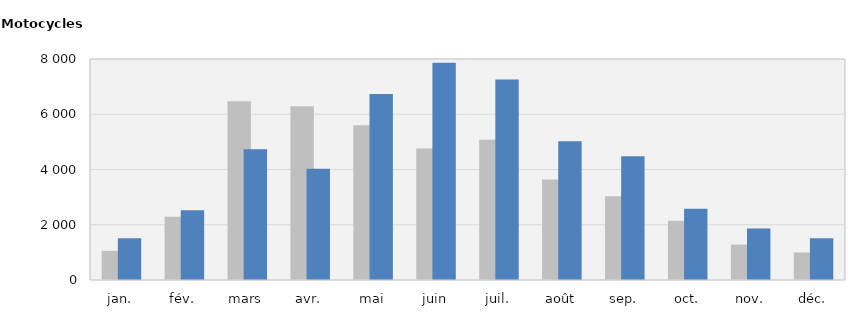
| Category | 2019 | 2020 |
|---|---|---|
| jan. | 1056 | 1512 |
| fév. | 2291 | 2527 |
| mars | 6473 | 4731 |
| avr. | 6294 | 4029 |
| mai | 5602 | 6733 |
| juin | 4763 | 7866 |
| juil. | 5076 | 7261 |
| août | 3642 | 5026 |
| sep. | 3033 | 4482 |
| oct. | 2144 | 2579 |
| nov. | 1283 | 1860 |
| déc. | 997 | 1514 |